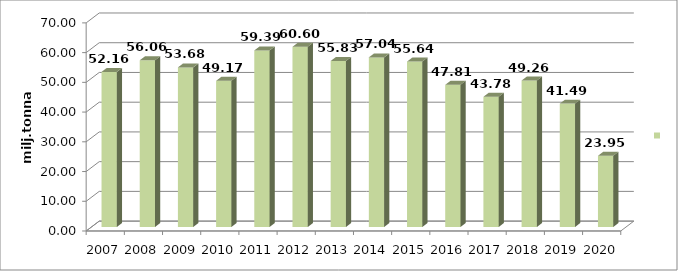
| Category | Series 0 |
|---|---|
| 2007.0 | 52.164 |
| 2008.0 | 56.061 |
| 2009.0 | 53.679 |
| 2010.0 | 49.165 |
| 2011.0 | 59.385 |
| 2012.0 | 60.602 |
| 2013.0 | 55.83 |
| 2014.0 | 57.04 |
| 2015.0 | 55.644 |
| 2016.0 | 47.813 |
| 2017.0 | 43.784 |
| 2018.0 | 49.26 |
| 2019.0 | 41.49 |
| 2020.0 | 23.952 |